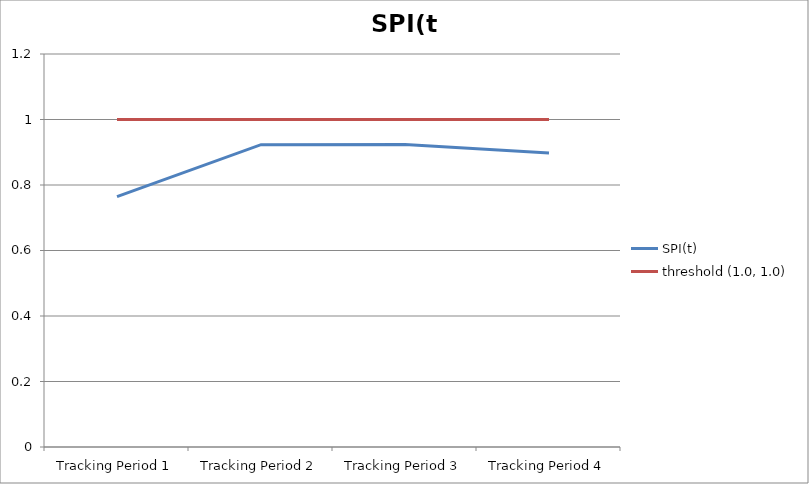
| Category | SPI(t) | threshold (1.0, 1.0) |
|---|---|---|
| Tracking Period 1 | 0.765 | 1 |
| Tracking Period 2 | 0.923 | 1 |
| Tracking Period 3 | 0.924 | 1 |
| Tracking Period 4 | 0.897 | 1 |